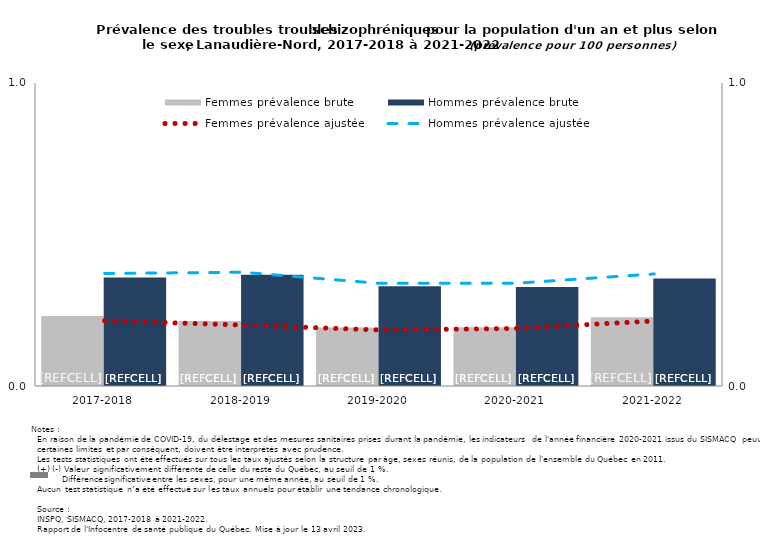
| Category | Femmes prévalence brute | Hommes prévalence brute |
|---|---|---|
| 2017-2018 | 0.231 | 0.358 |
| 2018-2019 | 0.215 | 0.367 |
| 2019-2020 | 0.193 | 0.33 |
| 2020-2021 | 0.194 | 0.327 |
| 2021-2022 | 0.227 | 0.355 |